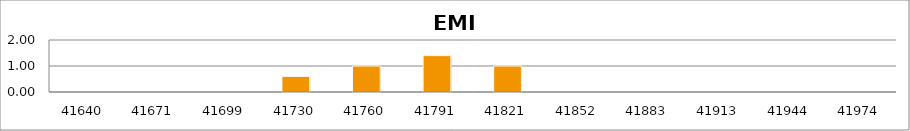
| Category | EMI /EMC |
|---|---|
| 2014-01-01 | 0 |
| 2014-02-01 | 0 |
| 2014-03-01 | 0 |
| 2014-04-01 | 0.6 |
| 2014-05-01 | 1 |
| 2014-06-01 | 1.4 |
| 2014-07-01 | 1 |
| 2014-08-01 | 0 |
| 2014-09-01 | 0 |
| 2014-10-01 | 0 |
| 2014-11-01 | 0 |
| 2014-12-01 | 0 |